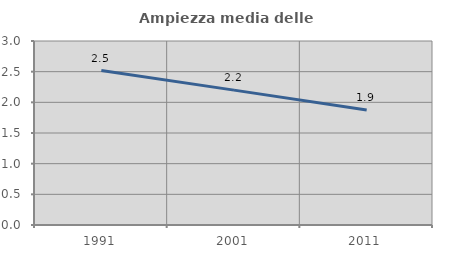
| Category | Ampiezza media delle famiglie |
|---|---|
| 1991.0 | 2.518 |
| 2001.0 | 2.199 |
| 2011.0 | 1.875 |